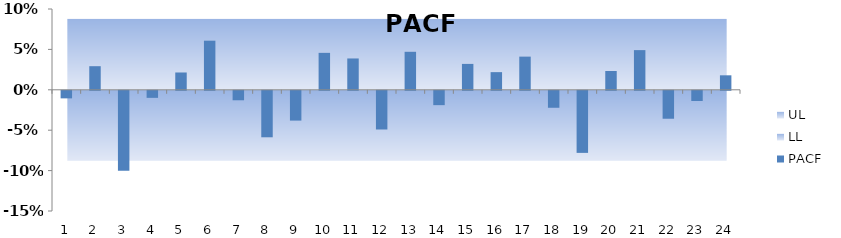
| Category | PACF |
|---|---|
| 0 | -0.009 |
| 1 | 0.029 |
| 2 | -0.099 |
| 3 | -0.009 |
| 4 | 0.021 |
| 5 | 0.061 |
| 6 | -0.012 |
| 7 | -0.058 |
| 8 | -0.037 |
| 9 | 0.046 |
| 10 | 0.039 |
| 11 | -0.048 |
| 12 | 0.047 |
| 13 | -0.018 |
| 14 | 0.032 |
| 15 | 0.022 |
| 16 | 0.041 |
| 17 | -0.021 |
| 18 | -0.077 |
| 19 | 0.023 |
| 20 | 0.049 |
| 21 | -0.035 |
| 22 | -0.013 |
| 23 | 0.018 |